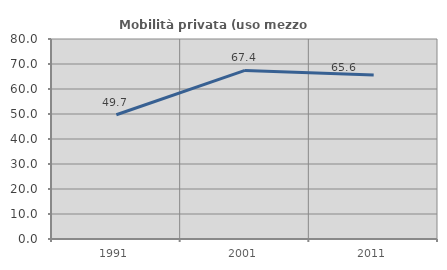
| Category | Mobilità privata (uso mezzo privato) |
|---|---|
| 1991.0 | 49.71 |
| 2001.0 | 67.44 |
| 2011.0 | 65.604 |